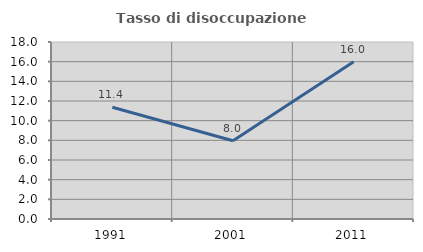
| Category | Tasso di disoccupazione giovanile  |
|---|---|
| 1991.0 | 11.37 |
| 2001.0 | 7.958 |
| 2011.0 | 16 |